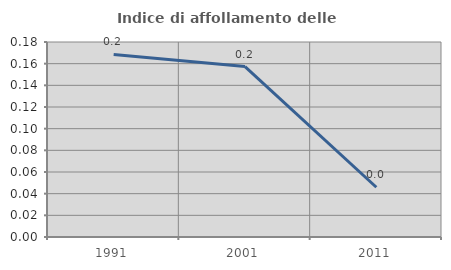
| Category | Indice di affollamento delle abitazioni  |
|---|---|
| 1991.0 | 0.169 |
| 2001.0 | 0.157 |
| 2011.0 | 0.046 |